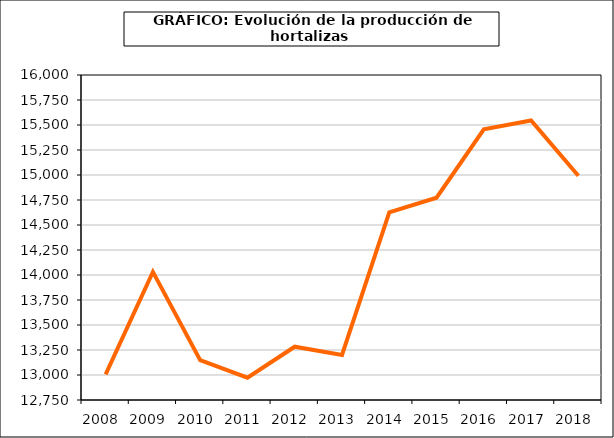
| Category | producción |
|---|---|
| 2008.0 | 13006.461 |
| 2009.0 | 14030.874 |
| 2010.0 | 13148.152 |
| 2011.0 | 12972.604 |
| 2012.0 | 13282.939 |
| 2013.0 | 13201.085 |
| 2014.0 | 14626.126 |
| 2015.0 | 14772.496 |
| 2016.0 | 15456.102 |
| 2017.0 | 15544.603 |
| 2018.0 | 14992.109 |